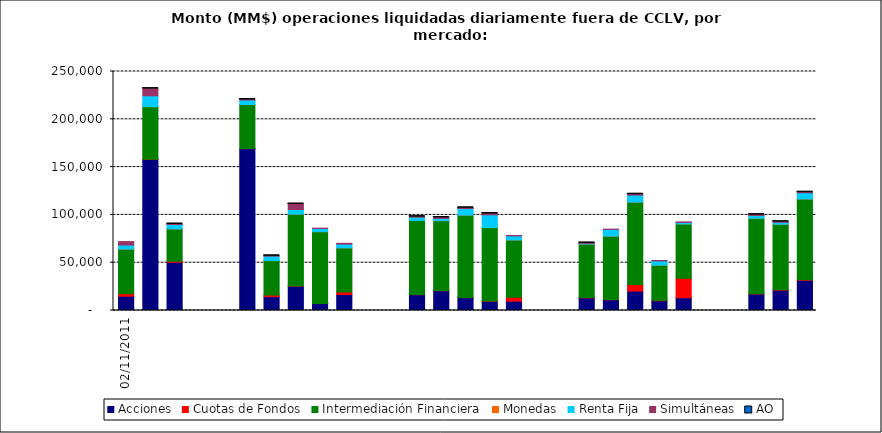
| Category | Acciones | Cuotas de Fondos | Intermediación Financiera | Monedas | Renta Fija | Simultáneas | AO |
|---|---|---|---|---|---|---|---|
| 02/11/2011 | 14919.819 | 2645.889 | 46695.586 | 26.644 | 4226.404 | 3563.878 | 0 |
| 03/11/2011 | 158124.005 | 100.037 | 54987.216 | 12.732 | 11357.844 | 7506.64 | 0.038 |
| 04/11/2011 | 50401.172 | 1118.7 | 33909.056 | 7.37 | 4522.84 | 530.874 | 0.141 |
| 07/11/2011 | 169313.549 | 107.331 | 45974.111 | 54.011 | 4740.702 | 487.259 | 0.273 |
| 08/11/2011 | 14500.63 | 1664.47 | 36025.079 | 46.207 | 4603.751 | 390.577 | 0.263 |
| 09/11/2011 | 25600.993 | 100.185 | 75160.116 | 17.664 | 4770.624 | 5763.831 | 0.016 |
| 10/11/2011 | 7280.976 | 80.692 | 75086.768 | 7.454 | 3289.145 | 383.707 | 0 |
| 11/11/2011 | 16748.529 | 2588.608 | 46186.905 | 2.708 | 3934.016 | 837.621 | 0 |
| 14/11/2011 | 16527.786 | 113.02 | 77587.378 | 5.402 | 3381.522 | 579.769 | 0.113 |
| 15/11/2011 | 20706.996 | 123.41 | 73119.864 | 60.055 | 2350.767 | 934.158 | 0.017 |
| 16/11/2011 | 13448.435 | 229.526 | 86120.571 | 16.152 | 6852.652 | 767.426 | 0.068 |
| 17/11/2011 | 9755.22 | 81.182 | 76913.92 | 11.23 | 13364.061 | 1349.009 | 0.163 |
| 18/11/2011 | 9797.961 | 4078.846 | 59935.933 | 3.9 | 4242.029 | 426.57 | 0 |
| 21/11/2011 | 13206.601 | 426.672 | 55812.174 | 34.371 | 740.114 | 446.601 | 0.434 |
| 22/11/2011 | 11256.28 | 377.974 | 66248.843 | 20.545 | 6901.215 | 287.793 | 0 |
| 23/11/2011 | 20298.599 | 7023.242 | 86099.292 | 22.486 | 7266.757 | 952.451 | 0.957 |
| 24/11/2011 | 10196.159 | 393.912 | 36809.365 | 19.208 | 4497.515 | 415.56 | 0 |
| 25/11/2011 | 13340.376 | 20316.66 | 56887.916 | 6.96 | 1578.566 | 529.709 | 0 |
| 28/11/2011 | 17287.115 | 107.813 | 79082.502 | 9.96 | 2917.888 | 913.595 | 0.076 |
| 29/11/2011 | 21197.485 | 490.543 | 68503.358 | 44.374 | 2080.155 | 601.254 | 0.132 |
| 30/11/2011 | 31591.344 | 622.679 | 84461.31 | 9.305 | 6493.499 | 598.358 | 0.05 |